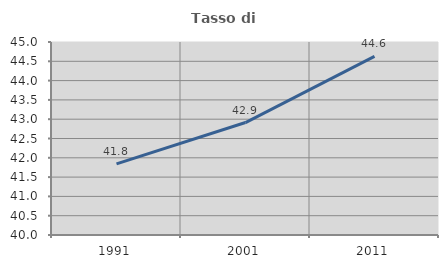
| Category | Tasso di occupazione   |
|---|---|
| 1991.0 | 41.844 |
| 2001.0 | 42.913 |
| 2011.0 | 44.628 |